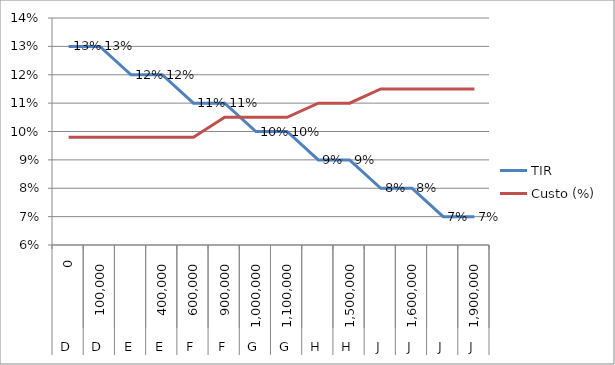
| Category | TIR | Custo (%) |
|---|---|---|
| 0.0 | 0.13 | 0.098 |
| 100000.0 | 0.13 | 0.098 |
| nan | 0.12 | 0.098 |
| 400000.0 | 0.12 | 0.098 |
| 600000.0 | 0.11 | 0.098 |
| 900000.0 | 0.11 | 0.105 |
| 1000000.0 | 0.1 | 0.105 |
| 1100000.0 | 0.1 | 0.105 |
| nan | 0.09 | 0.11 |
| 1500000.0 | 0.09 | 0.11 |
| nan | 0.08 | 0.115 |
| 1600000.0 | 0.08 | 0.115 |
| nan | 0.07 | 0.115 |
| 1900000.0 | 0.07 | 0.115 |